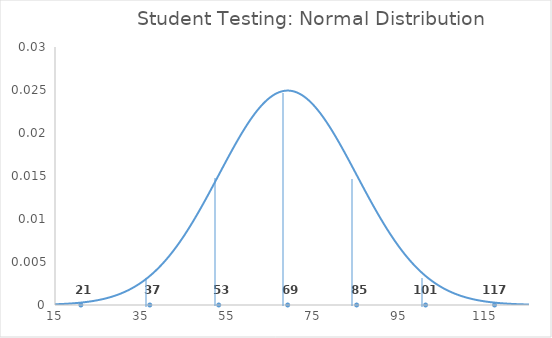
| Category | Series 0 |
|---|---|
| 1.0 | 0 |
| 2.0 | 0 |
| 3.0 | 0 |
| 4.0 | 0 |
| 5.0 | 0 |
| 6.0 | 0 |
| 7.0 | 0 |
| 8.0 | 0 |
| 9.0 | 0 |
| 10.0 | 0 |
| 11.0 | 0 |
| 12.0 | 0 |
| 13.0 | 0 |
| 14.0 | 0 |
| 15.0 | 0 |
| 16.0 | 0 |
| 17.0 | 0 |
| 18.0 | 0 |
| 19.0 | 0 |
| 20.0 | 0 |
| 21.0 | 0 |
| 22.0 | 0 |
| 23.0 | 0 |
| 24.0 | 0 |
| 25.0 | 0.001 |
| 26.0 | 0.001 |
| 27.0 | 0.001 |
| 28.0 | 0.001 |
| 29.0 | 0.001 |
| 30.0 | 0.001 |
| 31.0 | 0.001 |
| 32.0 | 0.002 |
| 33.0 | 0.002 |
| 34.0 | 0.002 |
| 35.0 | 0.003 |
| 36.0 | 0.003 |
| 37.0 | 0.003 |
| 38.0 | 0.004 |
| 39.0 | 0.004 |
| 40.0 | 0.005 |
| 41.0 | 0.005 |
| 42.0 | 0.006 |
| 43.0 | 0.007 |
| 44.0 | 0.007 |
| 45.0 | 0.008 |
| 46.0 | 0.009 |
| 47.0 | 0.01 |
| 48.0 | 0.011 |
| 49.0 | 0.011 |
| 50.0 | 0.012 |
| 51.0 | 0.013 |
| 52.0 | 0.014 |
| 53.0 | 0.015 |
| 54.0 | 0.016 |
| 55.0 | 0.017 |
| 56.0 | 0.018 |
| 57.0 | 0.019 |
| 58.0 | 0.02 |
| 59.0 | 0.021 |
| 60.0 | 0.021 |
| 61.0 | 0.022 |
| 62.0 | 0.023 |
| 63.0 | 0.023 |
| 64.0 | 0.024 |
| 65.0 | 0.024 |
| 66.0 | 0.024 |
| 67.0 | 0.025 |
| 68.0 | 0.025 |
| 69.0 | 0.025 |
| 70.0 | 0.025 |
| 71.0 | 0.025 |
| 72.0 | 0.024 |
| 73.0 | 0.024 |
| 74.0 | 0.024 |
| 75.0 | 0.023 |
| 76.0 | 0.023 |
| 77.0 | 0.022 |
| 78.0 | 0.021 |
| 79.0 | 0.021 |
| 80.0 | 0.02 |
| 81.0 | 0.019 |
| 82.0 | 0.018 |
| 83.0 | 0.017 |
| 84.0 | 0.016 |
| 85.0 | 0.015 |
| 86.0 | 0.014 |
| 87.0 | 0.013 |
| 88.0 | 0.012 |
| 89.0 | 0.011 |
| 90.0 | 0.011 |
| 91.0 | 0.01 |
| 92.0 | 0.009 |
| 93.0 | 0.008 |
| 94.0 | 0.007 |
| 95.0 | 0.007 |
| 96.0 | 0.006 |
| 97.0 | 0.005 |
| 98.0 | 0.005 |
| 99.0 | 0.004 |
| 100.0 | 0.004 |
| 101.0 | 0.003 |
| 102.0 | 0.003 |
| 103.0 | 0.003 |
| 104.0 | 0.002 |
| 105.0 | 0.002 |
| 106.0 | 0.002 |
| 107.0 | 0.001 |
| 108.0 | 0.001 |
| 109.0 | 0.001 |
| 110.0 | 0.001 |
| 111.0 | 0.001 |
| 112.0 | 0.001 |
| 113.0 | 0.001 |
| 114.0 | 0 |
| 115.0 | 0 |
| 116.0 | 0 |
| 117.0 | 0 |
| 118.0 | 0 |
| 119.0 | 0 |
| 120.0 | 0 |
| 121.0 | 0 |
| 122.0 | 0 |
| 123.0 | 0 |
| 124.0 | 0 |
| 125.0 | 0 |
| 126.0 | 0 |
| 127.0 | 0 |
| 128.0 | 0 |
| 129.0 | 0 |
| 130.0 | 0 |
| 131.0 | 0 |
| 132.0 | 0 |
| 133.0 | 0 |
| 134.0 | 0 |
| 135.0 | 0 |
| 136.0 | 0 |
| 137.0 | 0 |
| 138.0 | 0 |
| 139.0 | 0 |
| 140.0 | 0 |
| 141.0 | 0 |
| 142.0 | 0 |
| 143.0 | 0 |
| 144.0 | 0 |
| 145.0 | 0 |
| 146.0 | 0 |
| 147.0 | 0 |
| 148.0 | 0 |
| 149.0 | 0 |
| 150.0 | 0 |